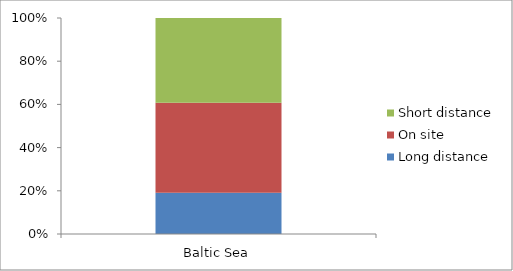
| Category | Long distance | On site | Short distance |
|---|---|---|---|
| Baltic Sea | 27616 | 60217.75 | 56672.75 |